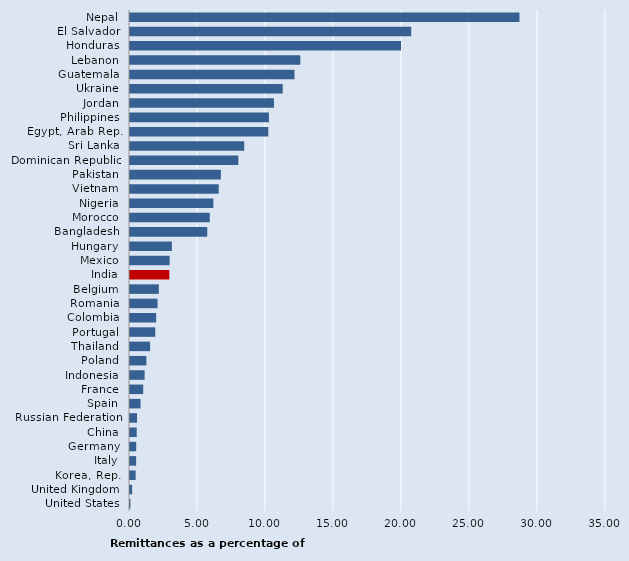
| Category | Series 0 |
|---|---|
| Nepal | 28.637 |
| El Salvador | 20.678 |
| Honduras | 19.927 |
| Lebanon | 12.524 |
| Guatemala | 12.096 |
| Ukraine | 11.231 |
| Jordan | 10.585 |
| Philippines | 10.217 |
| Egypt, Arab Rep. | 10.17 |
| Sri Lanka | 8.398 |
| Dominican Republic | 7.965 |
| Pakistan | 6.682 |
| Vietnam | 6.525 |
| Nigeria | 6.131 |
| Morocco | 5.867 |
| Bangladesh | 5.679 |
| Hungary | 3.078 |
| Mexico | 2.913 |
| India | 2.891 |
| Belgium | 2.12 |
| Romania | 2.027 |
| Colombia | 1.923 |
| Portugal | 1.857 |
| Thailand | 1.478 |
| Poland | 1.203 |
| Indonesia | 1.076 |
| France | 0.972 |
| Spain | 0.774 |
| Russian Federation | 0.519 |
| China | 0.495 |
| Germany | 0.457 |
| Italy | 0.453 |
| Korea, Rep. | 0.415 |
| United Kingdom | 0.158 |
| United States | 0.032 |